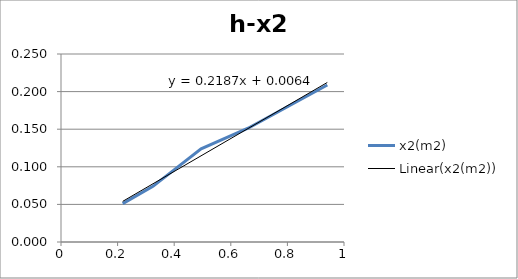
| Category | x2(m2) |
|---|---|
| 0.218 | 0.051 |
| 0.325 | 0.074 |
| 0.495 | 0.124 |
| 0.661 | 0.151 |
| 0.941 | 0.209 |